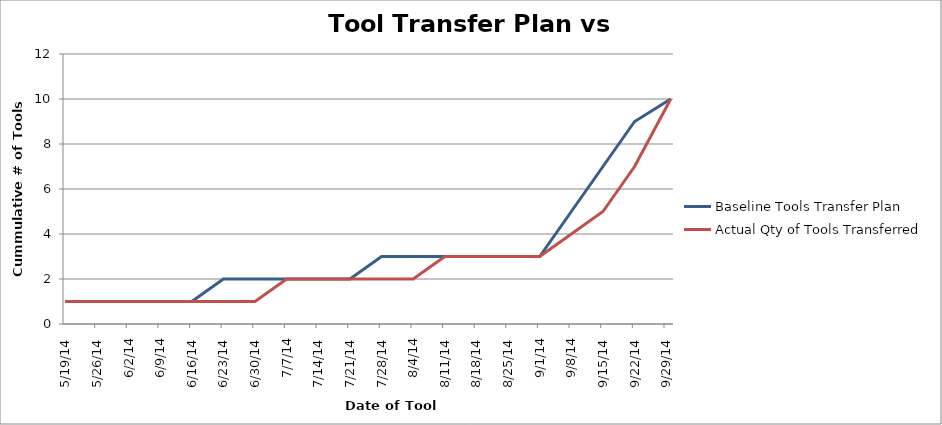
| Category | Baseline Tools Transfer Plan | Actual Qty of Tools Transferred |
|---|---|---|
| 5/19/14 | 1 | 1 |
| 5/26/14 | 1 | 1 |
| 6/2/14 | 1 | 1 |
| 6/9/14 | 1 | 1 |
| 6/16/14 | 1 | 1 |
| 6/23/14 | 2 | 1 |
| 6/30/14 | 2 | 1 |
| 7/7/14 | 2 | 2 |
| 7/14/14 | 2 | 2 |
| 7/21/14 | 2 | 2 |
| 7/28/14 | 3 | 2 |
| 8/4/14 | 3 | 2 |
| 8/11/14 | 3 | 3 |
| 8/18/14 | 3 | 3 |
| 8/25/14 | 3 | 3 |
| 9/1/14 | 3 | 3 |
| 9/8/14 | 5 | 4 |
| 9/15/14 | 7 | 5 |
| 9/22/14 | 9 | 7 |
| 9/30/14 | 10 | 10 |